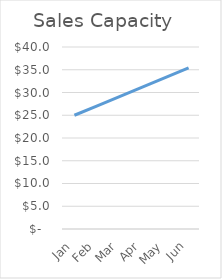
| Category | Sales Capacity  |
|---|---|
| Jan | 25 |
| Feb | 27.083 |
| Mar | 29.167 |
| Apr | 31.25 |
| May | 33.333 |
| Jun | 35.417 |